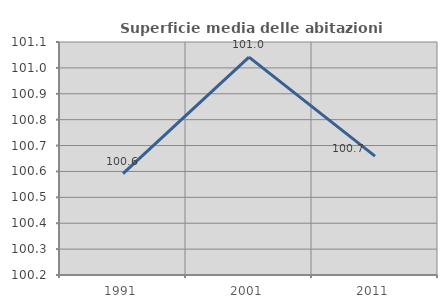
| Category | Superficie media delle abitazioni occupate |
|---|---|
| 1991.0 | 100.591 |
| 2001.0 | 101.041 |
| 2011.0 | 100.659 |